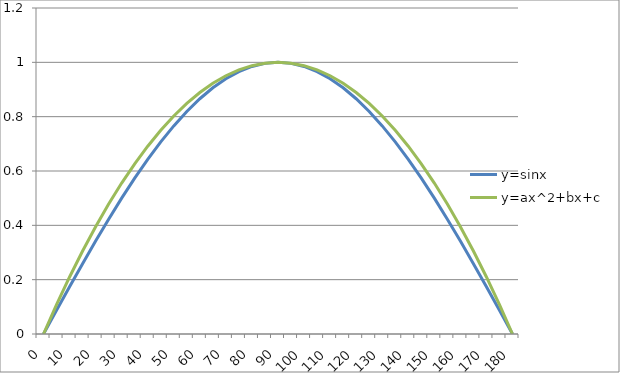
| Category | y=sinx | y=ax^2+bx+c |
|---|---|---|
| 0 | 0 | 0 |
| 5 | 0.087 | 0.108 |
| 10 | 0.174 | 0.21 |
| 15 | 0.259 | 0.306 |
| 20 | 0.342 | 0.395 |
| 25 | 0.423 | 0.478 |
| 30 | 0.5 | 0.556 |
| 35 | 0.574 | 0.627 |
| 40 | 0.643 | 0.691 |
| 45 | 0.707 | 0.75 |
| 50 | 0.766 | 0.802 |
| 55 | 0.819 | 0.849 |
| 60 | 0.866 | 0.889 |
| 65 | 0.906 | 0.923 |
| 70 | 0.94 | 0.951 |
| 75 | 0.966 | 0.972 |
| 80 | 0.985 | 0.988 |
| 85 | 0.996 | 0.997 |
| 90 | 1 | 1 |
| 95 | 0.996 | 0.997 |
| 100 | 0.985 | 0.988 |
| 105 | 0.966 | 0.972 |
| 110 | 0.94 | 0.951 |
| 115 | 0.906 | 0.923 |
| 120 | 0.866 | 0.889 |
| 125 | 0.819 | 0.849 |
| 130 | 0.766 | 0.802 |
| 135 | 0.707 | 0.75 |
| 140 | 0.643 | 0.691 |
| 145 | 0.574 | 0.627 |
| 150 | 0.5 | 0.556 |
| 155 | 0.423 | 0.478 |
| 160 | 0.342 | 0.395 |
| 165 | 0.259 | 0.306 |
| 170 | 0.174 | 0.21 |
| 175 | 0.087 | 0.108 |
| 180 | 0 | 0 |